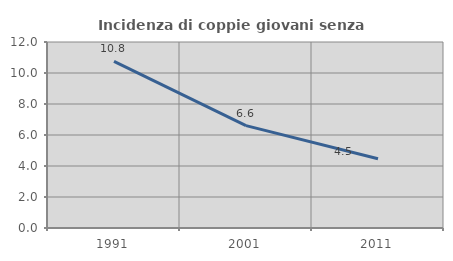
| Category | Incidenza di coppie giovani senza figli |
|---|---|
| 1991.0 | 10.753 |
| 2001.0 | 6.604 |
| 2011.0 | 4.464 |